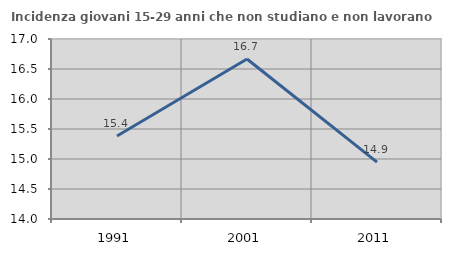
| Category | Incidenza giovani 15-29 anni che non studiano e non lavorano  |
|---|---|
| 1991.0 | 15.385 |
| 2001.0 | 16.667 |
| 2011.0 | 14.948 |